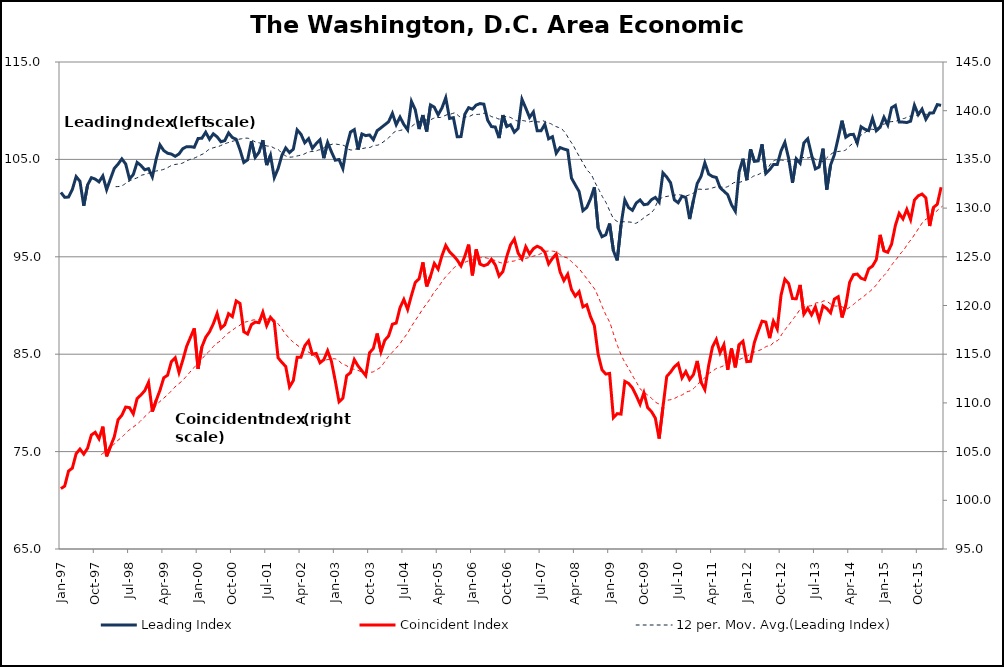
| Category | Leading Index |
|---|---|
| 1997-01-01 | 101.605 |
| 1997-02-01 | 101.105 |
| 1997-03-01 | 101.137 |
| 1997-04-01 | 101.917 |
| 1997-05-01 | 103.234 |
| 1997-06-01 | 102.755 |
| 1997-07-01 | 100.239 |
| 1997-08-01 | 102.372 |
| 1997-09-01 | 103.123 |
| 1997-10-01 | 102.979 |
| 1997-11-01 | 102.693 |
| 1997-12-01 | 103.304 |
| 1998-01-01 | 101.889 |
| 1998-02-01 | 102.996 |
| 1998-03-01 | 104.068 |
| 1998-04-01 | 104.519 |
| 1998-05-01 | 105.054 |
| 1998-06-01 | 104.53 |
| 1998-07-01 | 102.989 |
| 1998-08-01 | 103.45 |
| 1998-09-01 | 104.69 |
| 1998-10-01 | 104.375 |
| 1998-11-01 | 103.935 |
| 1998-12-01 | 104.05 |
| 1999-01-01 | 103.202 |
| 1999-02-01 | 105.029 |
| 1999-03-01 | 106.49 |
| 1999-04-01 | 105.906 |
| 1999-05-01 | 105.634 |
| 1999-06-01 | 105.545 |
| 1999-07-01 | 105.315 |
| 1999-08-01 | 105.562 |
| 1999-09-01 | 106.108 |
| 1999-10-01 | 106.306 |
| 1999-11-01 | 106.303 |
| 1999-12-01 | 106.244 |
| 2000-01-01 | 107.142 |
| 2000-02-01 | 107.178 |
| 2000-03-01 | 107.789 |
| 2000-04-01 | 107.074 |
| 2000-05-01 | 107.625 |
| 2000-06-01 | 107.313 |
| 2000-07-01 | 106.813 |
| 2000-08-01 | 106.929 |
| 2000-09-01 | 107.721 |
| 2000-10-01 | 107.247 |
| 2000-11-01 | 107.065 |
| 2000-12-01 | 105.987 |
| 2001-01-01 | 104.684 |
| 2001-02-01 | 104.952 |
| 2001-03-01 | 106.865 |
| 2001-04-01 | 105.212 |
| 2001-05-01 | 105.734 |
| 2001-06-01 | 106.974 |
| 2001-07-01 | 104.414 |
| 2001-08-01 | 105.425 |
| 2001-09-01 | 103.13 |
| 2001-10-01 | 104.057 |
| 2001-11-01 | 105.425 |
| 2001-12-01 | 106.174 |
| 2002-01-01 | 105.699 |
| 2002-02-01 | 106.05 |
| 2002-03-01 | 108.03 |
| 2002-04-01 | 107.583 |
| 2002-05-01 | 106.709 |
| 2002-06-01 | 107.131 |
| 2002-07-01 | 106.141 |
| 2002-08-01 | 106.623 |
| 2002-09-01 | 107.02 |
| 2002-10-01 | 105.124 |
| 2002-11-01 | 106.739 |
| 2002-12-01 | 105.783 |
| 2003-01-01 | 104.916 |
| 2003-02-01 | 104.988 |
| 2003-03-01 | 104.051 |
| 2003-04-01 | 106.328 |
| 2003-05-01 | 107.807 |
| 2003-06-01 | 108.055 |
| 2003-07-01 | 105.998 |
| 2003-08-01 | 107.613 |
| 2003-09-01 | 107.44 |
| 2003-10-01 | 107.509 |
| 2003-11-01 | 107.028 |
| 2003-12-01 | 107.95 |
| 2004-01-01 | 108.242 |
| 2004-02-01 | 108.554 |
| 2004-03-01 | 108.863 |
| 2004-04-01 | 109.728 |
| 2004-05-01 | 108.567 |
| 2004-06-01 | 109.337 |
| 2004-07-01 | 108.586 |
| 2004-08-01 | 108.035 |
| 2004-09-01 | 110.957 |
| 2004-10-01 | 110.098 |
| 2004-11-01 | 108.114 |
| 2004-12-01 | 109.553 |
| 2005-01-01 | 107.862 |
| 2005-02-01 | 110.59 |
| 2005-03-01 | 110.365 |
| 2005-04-01 | 109.576 |
| 2005-05-01 | 110.28 |
| 2005-06-01 | 111.331 |
| 2005-07-01 | 109.204 |
| 2005-08-01 | 109.285 |
| 2005-09-01 | 107.332 |
| 2005-10-01 | 107.339 |
| 2005-11-01 | 109.629 |
| 2005-12-01 | 110.31 |
| 2006-01-01 | 110.158 |
| 2006-02-01 | 110.581 |
| 2006-03-01 | 110.732 |
| 2006-04-01 | 110.67 |
| 2006-05-01 | 109.021 |
| 2006-06-01 | 108.369 |
| 2006-07-01 | 108.322 |
| 2006-08-01 | 107.186 |
| 2006-09-01 | 109.553 |
| 2006-10-01 | 108.371 |
| 2006-11-01 | 108.554 |
| 2006-12-01 | 107.79 |
| 2007-01-01 | 108.198 |
| 2007-02-01 | 111.175 |
| 2007-03-01 | 110.267 |
| 2007-04-01 | 109.311 |
| 2007-05-01 | 109.869 |
| 2007-06-01 | 107.939 |
| 2007-07-01 | 107.938 |
| 2007-08-01 | 108.595 |
| 2007-09-01 | 107.116 |
| 2007-10-01 | 107.328 |
| 2007-11-01 | 105.639 |
| 2007-12-01 | 106.215 |
| 2008-01-01 | 106.066 |
| 2008-02-01 | 105.953 |
| 2008-03-01 | 103.081 |
| 2008-04-01 | 102.38 |
| 2008-05-01 | 101.7 |
| 2008-06-01 | 99.737 |
| 2008-07-01 | 100.066 |
| 2008-08-01 | 100.948 |
| 2008-09-01 | 102.139 |
| 2008-10-01 | 97.949 |
| 2008-11-01 | 97.059 |
| 2008-12-01 | 97.257 |
| 2009-01-01 | 98.415 |
| 2009-02-01 | 95.624 |
| 2009-03-01 | 94.628 |
| 2009-04-01 | 98.269 |
| 2009-05-01 | 100.833 |
| 2009-06-01 | 100.052 |
| 2009-07-01 | 99.774 |
| 2009-08-01 | 100.523 |
| 2009-09-01 | 100.833 |
| 2009-10-01 | 100.35 |
| 2009-11-01 | 100.41 |
| 2009-12-01 | 100.869 |
| 2010-01-01 | 101.096 |
| 2010-02-01 | 100.611 |
| 2010-03-01 | 103.615 |
| 2010-04-01 | 103.185 |
| 2010-05-01 | 102.606 |
| 2010-06-01 | 100.843 |
| 2010-07-01 | 100.551 |
| 2010-08-01 | 101.22 |
| 2010-09-01 | 101.087 |
| 2010-10-01 | 98.873 |
| 2010-11-01 | 100.781 |
| 2010-12-01 | 102.53 |
| 2011-01-01 | 103.256 |
| 2011-02-01 | 104.649 |
| 2011-03-01 | 103.488 |
| 2011-04-01 | 103.245 |
| 2011-05-01 | 103.148 |
| 2011-06-01 | 102.096 |
| 2011-07-01 | 101.736 |
| 2011-08-01 | 101.373 |
| 2011-09-01 | 100.338 |
| 2011-10-01 | 99.678 |
| 2011-11-01 | 103.735 |
| 2011-12-01 | 105.067 |
| 2012-01-01 | 102.929 |
| 2012-02-01 | 106.037 |
| 2012-03-01 | 104.796 |
| 2012-04-01 | 104.849 |
| 2012-05-01 | 106.552 |
| 2012-06-01 | 103.556 |
| 2012-07-01 | 103.941 |
| 2012-08-01 | 104.465 |
| 2012-09-01 | 104.466 |
| 2012-10-01 | 105.879 |
| 2012-11-01 | 106.751 |
| 2012-12-01 | 105.084 |
| 2013-01-01 | 102.6 |
| 2013-02-01 | 105.056 |
| 2013-03-01 | 104.602 |
| 2013-04-01 | 106.707 |
| 2013-05-01 | 107.115 |
| 2013-06-01 | 105.467 |
| 2013-07-01 | 104.028 |
| 2013-08-01 | 104.224 |
| 2013-09-01 | 106.099 |
| 2013-10-01 | 101.898 |
| 2013-11-01 | 104.424 |
| 2013-12-01 | 105.484 |
| 2014-01-01 | 107.205 |
| 2014-02-01 | 108.975 |
| 2014-03-01 | 107.277 |
| 2014-04-01 | 107.54 |
| 2014-05-01 | 107.573 |
| 2014-06-01 | 106.66 |
| 2014-07-01 | 108.352 |
| 2014-08-01 | 108.095 |
| 2014-09-01 | 107.956 |
| 2014-10-01 | 109.224 |
| 2014-11-01 | 107.937 |
| 2014-12-01 | 108.297 |
| 2015-01-01 | 109.319 |
| 2015-02-01 | 108.542 |
| 2015-03-01 | 110.304 |
| 2015-04-01 | 110.541 |
| 2015-05-01 | 108.833 |
| 2015-06-01 | 108.83 |
| 2015-07-01 | 108.786 |
| 2015-08-01 | 108.926 |
| 2015-09-01 | 110.557 |
| 2015-10-01 | 109.594 |
| 2015-11-01 | 110.161 |
| 2015-12-01 | 109.12 |
| 2016-01-01 | 109.757 |
| 2016-02-01 | 109.778 |
| 2016-03-01 | 110.624 |
| 2016-04-01 | 110.551 |